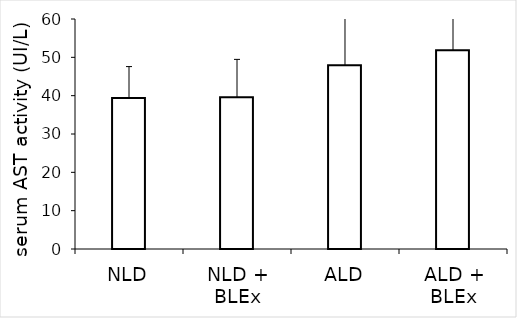
| Category | Series 0 |
|---|---|
| NLD | 39.411 |
| NLD + BLEx | 39.588 |
| ALD | 47.964 |
| ALD + BLEx | 51.877 |